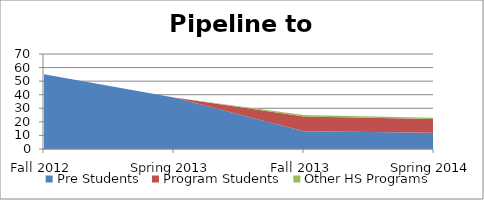
| Category | Pre Students | Program Students | Other HS Programs |
|---|---|---|---|
| Fall 2012 | 55 | 0 | 0 |
| Spring 2013 | 38 | 0 | 0 |
| Fall 2013 | 13 | 11 | 1 |
| Spring 2014 | 12 | 10 | 1 |